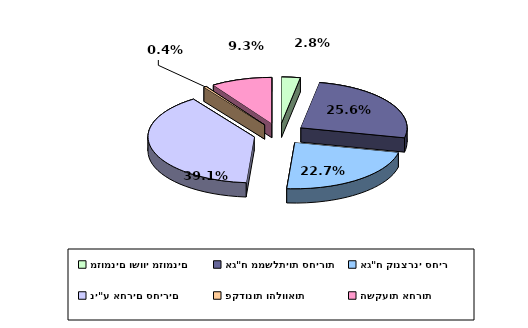
| Category | Series 0 |
|---|---|
| מזומנים ושווי מזומנים | 0.028 |
| אג"ח ממשלתיות סחירות | 0.256 |
| אג"ח קונצרני סחיר | 0.227 |
| ני"ע אחרים סחירים | 0.391 |
| פקדונות והלוואות | 0.004 |
| השקעות אחרות | 0.093 |